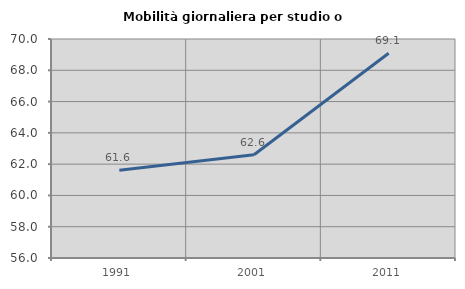
| Category | Mobilità giornaliera per studio o lavoro |
|---|---|
| 1991.0 | 61.616 |
| 2001.0 | 62.597 |
| 2011.0 | 69.085 |